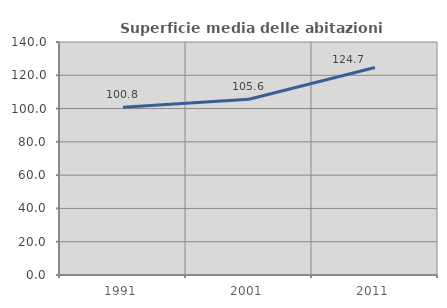
| Category | Superficie media delle abitazioni occupate |
|---|---|
| 1991.0 | 100.825 |
| 2001.0 | 105.633 |
| 2011.0 | 124.673 |